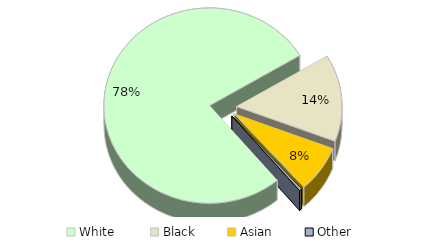
| Category | Series 0 |
|---|---|
| White  | 0.775 |
| Black | 0.144 |
| Asian | 0.077 |
| Other | 0.004 |